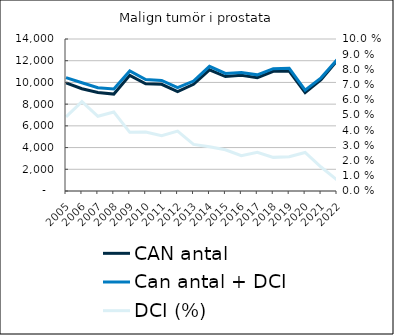
| Category |  CAN antal  |  Can antal + DCI  |
|---|---|---|
| 2005.0 | 9956 | 10442 |
| 2006.0 | 9415 | 9969 |
| 2007.0 | 9072 | 9518 |
| 2008.0 | 8928 | 9392 |
| 2009.0 | 10650 | 11061 |
| 2010.0 | 9877 | 10260 |
| 2011.0 | 9827 | 10185 |
| 2012.0 | 9164 | 9525 |
| 2013.0 | 9826 | 10127 |
| 2014.0 | 11157 | 11482 |
| 2015.0 | 10539 | 10825 |
| 2016.0 | 10670 | 10918 |
| 2017.0 | 10433 | 10698 |
| 2018.0 | 11027 | 11271 |
| 2019.0 | 11047 | 11296 |
| 2020.0 | 9065 | 9295 |
| 2021.0 | 10261 | 10423 |
| 2022.0 | 12004 | 12091 |